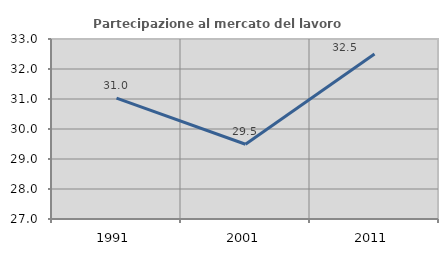
| Category | Partecipazione al mercato del lavoro  femminile |
|---|---|
| 1991.0 | 31.03 |
| 2001.0 | 29.491 |
| 2011.0 | 32.498 |